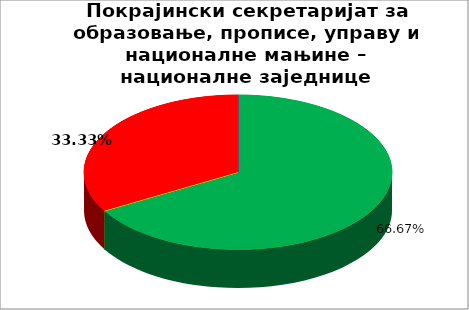
| Category | Покрајински секретаријат за образовање, прописе, управу и националне мањине – националне заједнице |
|---|---|
| 0 | 0.667 |
| 1 | 0 |
| 2 | 0 |
| 3 | 0.333 |
| 4 | 0 |